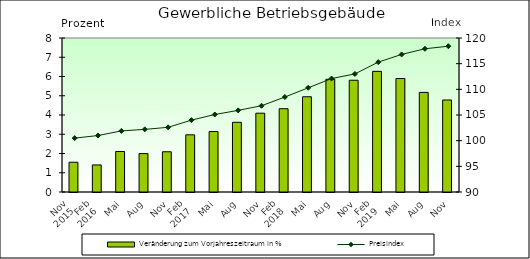
| Category | Veränderung zum Vorjahreszeitraum in % |
|---|---|
| 0 | 1.546 |
| 1 | 1.406 |
| 2 | 2.104 |
| 3 | 1.996 |
| 4 | 2.09 |
| 5 | 2.97 |
| 6 | 3.14 |
| 7 | 3.62 |
| 8 | 4.094 |
| 9 | 4.327 |
| 10 | 4.948 |
| 11 | 5.855 |
| 12 | 5.805 |
| 13 | 6.267 |
| 14 | 5.893 |
| 15 | 5.174 |
| 16 | 4.779 |